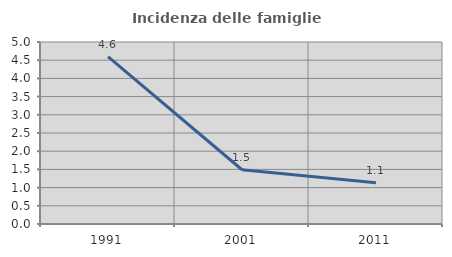
| Category | Incidenza delle famiglie numerose |
|---|---|
| 1991.0 | 4.597 |
| 2001.0 | 1.49 |
| 2011.0 | 1.13 |